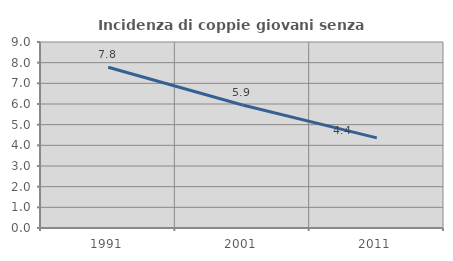
| Category | Incidenza di coppie giovani senza figli |
|---|---|
| 1991.0 | 7.781 |
| 2001.0 | 5.949 |
| 2011.0 | 4.36 |